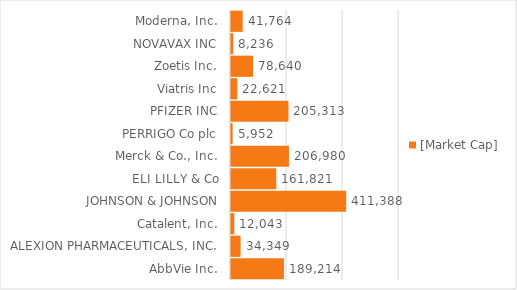
| Category | [Market Cap] |
|---|---|
| AbbVie Inc. | 189214.223 |
| ALEXION PHARMACEUTICALS, INC. | 34349.045 |
| Catalent, Inc. | 12042.871 |
| JOHNSON & JOHNSON | 411388.392 |
| ELI LILLY & Co | 161820.594 |
| Merck & Co., Inc. | 206979.822 |
| PERRIGO Co plc | 5952.06 |
| PFIZER INC | 205312.542 |
| Viatris Inc | 22620.728 |
| Zoetis Inc. | 78640.035 |
| NOVAVAX INC | 8236.004 |
| Moderna, Inc. | 41763.928 |